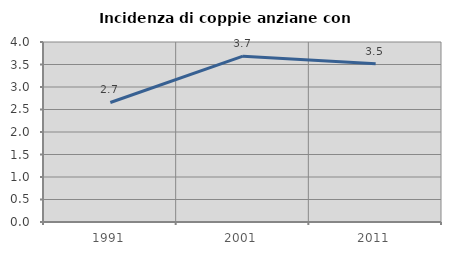
| Category | Incidenza di coppie anziane con figli |
|---|---|
| 1991.0 | 2.656 |
| 2001.0 | 3.685 |
| 2011.0 | 3.519 |